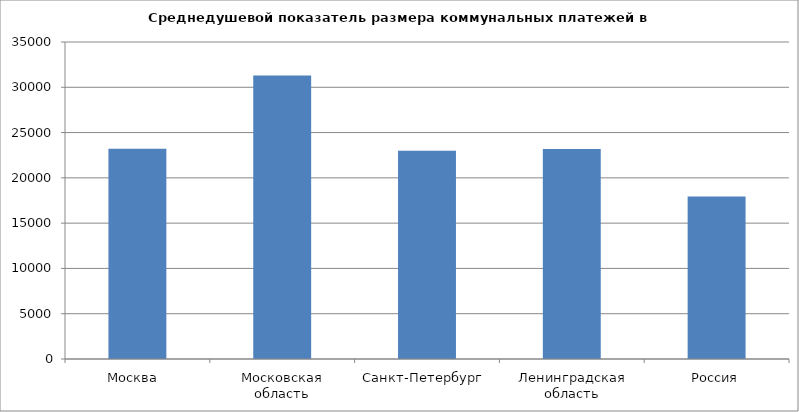
| Category | Среднедушевой показатель коммунальных платежей в год, руб. |
|---|---|
| Москва  | 23208 |
| Московская область | 31288 |
| Санкт-Петербург  | 22995 |
| Ленинградская область | 23196 |
| Россия | 17936 |